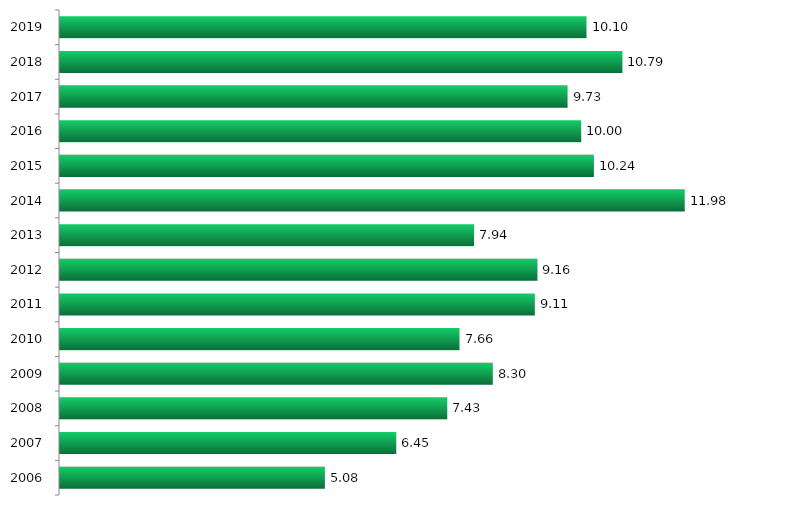
| Category | Concorrência |
|---|---|
| 2006.0 | 5.08 |
| 2007.0 | 6.449 |
| 2008.0 | 7.427 |
| 2009.0 | 8.301 |
| 2010.0 | 7.662 |
| 2011.0 | 9.106 |
| 2012.0 | 9.157 |
| 2013.0 | 7.941 |
| 2014.0 | 11.981 |
| 2015.0 | 10.24 |
| 2016.0 | 9.996 |
| 2017.0 | 9.734 |
| 2018.0 | 10.786 |
| 2019.0 | 10.098 |